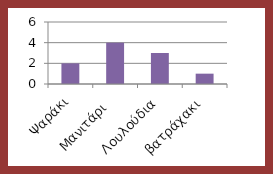
| Category | Series 0 |
|---|---|
| Ψαράκι | 2 |
| Μανιτάρι  | 4 |
| Λουλούδια | 3 |
| βατράχακι | 1 |